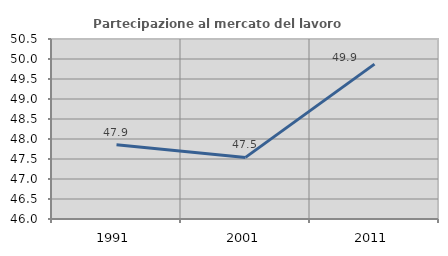
| Category | Partecipazione al mercato del lavoro  femminile |
|---|---|
| 1991.0 | 47.858 |
| 2001.0 | 47.54 |
| 2011.0 | 49.872 |